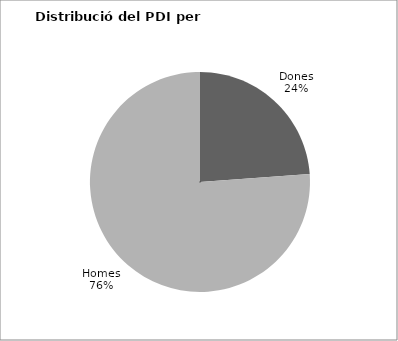
| Category | Series 0 |
|---|---|
| Dones | 607 |
| Homes | 1940 |